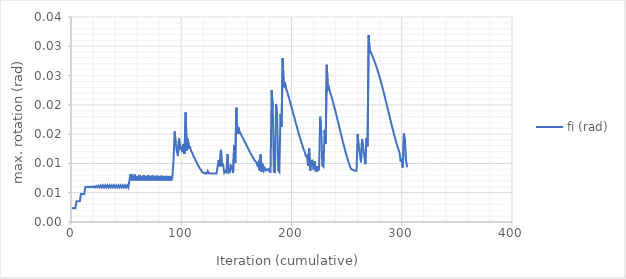
| Category | fi (rad) |
|---|---|
| 1.0 | 0.002 |
| 2.0 | 0.002 |
| 3.0 | 0.002 |
| 4.0 | 0.002 |
| 5.0 | 0.004 |
| 6.0 | 0.004 |
| 7.0 | 0.004 |
| 8.0 | 0.004 |
| 9.0 | 0.005 |
| 10.0 | 0.005 |
| 11.0 | 0.005 |
| 12.0 | 0.005 |
| 13.0 | 0.006 |
| 14.0 | 0.006 |
| 15.0 | 0.006 |
| 16.0 | 0.006 |
| 17.0 | 0.006 |
| 18.0 | 0.006 |
| 19.0 | 0.006 |
| 20.0 | 0.006 |
| 21.0 | 0.006 |
| 22.0 | 0.006 |
| 23.0 | 0.006 |
| 24.0 | 0.006 |
| 25.0 | 0.006 |
| 26.0 | 0.006 |
| 27.0 | 0.006 |
| 28.0 | 0.006 |
| 29.0 | 0.006 |
| 30.0 | 0.006 |
| 31.0 | 0.006 |
| 32.0 | 0.006 |
| 33.0 | 0.006 |
| 34.0 | 0.006 |
| 35.0 | 0.006 |
| 36.0 | 0.006 |
| 37.0 | 0.006 |
| 38.0 | 0.006 |
| 39.0 | 0.006 |
| 40.0 | 0.006 |
| 41.0 | 0.006 |
| 42.0 | 0.006 |
| 43.0 | 0.006 |
| 44.0 | 0.006 |
| 45.0 | 0.006 |
| 46.0 | 0.006 |
| 47.0 | 0.006 |
| 48.0 | 0.006 |
| 49.0 | 0.006 |
| 50.0 | 0.006 |
| 51.0 | 0.006 |
| 52.0 | 0.006 |
| 53.0 | 0.007 |
| 54.0 | 0.008 |
| 55.0 | 0.007 |
| 56.0 | 0.008 |
| 57.0 | 0.007 |
| 58.0 | 0.008 |
| 59.0 | 0.007 |
| 60.0 | 0.008 |
| 61.0 | 0.007 |
| 62.0 | 0.008 |
| 63.0 | 0.007 |
| 64.0 | 0.008 |
| 65.0 | 0.007 |
| 66.0 | 0.008 |
| 67.0 | 0.007 |
| 68.0 | 0.008 |
| 69.0 | 0.007 |
| 70.0 | 0.008 |
| 71.0 | 0.007 |
| 72.0 | 0.008 |
| 73.0 | 0.007 |
| 74.0 | 0.008 |
| 75.0 | 0.007 |
| 76.0 | 0.008 |
| 77.0 | 0.007 |
| 78.0 | 0.008 |
| 79.0 | 0.007 |
| 80.0 | 0.008 |
| 81.0 | 0.007 |
| 82.0 | 0.008 |
| 83.0 | 0.007 |
| 84.0 | 0.008 |
| 85.0 | 0.007 |
| 86.0 | 0.008 |
| 87.0 | 0.007 |
| 88.0 | 0.008 |
| 89.0 | 0.007 |
| 90.0 | 0.008 |
| 91.0 | 0.007 |
| 92.0 | 0.008 |
| 93.0 | 0.011 |
| 94.0 | 0.015 |
| 95.0 | 0.014 |
| 96.0 | 0.012 |
| 97.0 | 0.011 |
| 98.0 | 0.014 |
| 99.0 | 0.012 |
| 100.0 | 0.013 |
| 101.0 | 0.012 |
| 102.0 | 0.013 |
| 103.0 | 0.012 |
| 104.0 | 0.019 |
| 105.0 | 0.012 |
| 106.0 | 0.014 |
| 107.0 | 0.013 |
| 108.0 | 0.013 |
| 109.0 | 0.012 |
| 110.0 | 0.012 |
| 111.0 | 0.011 |
| 112.0 | 0.011 |
| 113.0 | 0.011 |
| 114.0 | 0.01 |
| 115.0 | 0.01 |
| 116.0 | 0.009 |
| 117.0 | 0.009 |
| 118.0 | 0.009 |
| 119.0 | 0.009 |
| 120.0 | 0.008 |
| 121.0 | 0.008 |
| 122.0 | 0.008 |
| 123.0 | 0.008 |
| 124.0 | 0.009 |
| 125.0 | 0.008 |
| 126.0 | 0.008 |
| 127.0 | 0.008 |
| 128.0 | 0.008 |
| 129.0 | 0.008 |
| 130.0 | 0.008 |
| 131.0 | 0.008 |
| 132.0 | 0.008 |
| 133.0 | 0.009 |
| 134.0 | 0.011 |
| 135.0 | 0.009 |
| 136.0 | 0.012 |
| 137.0 | 0.01 |
| 138.0 | 0.01 |
| 139.0 | 0.008 |
| 140.0 | 0.009 |
| 141.0 | 0.009 |
| 142.0 | 0.012 |
| 143.0 | 0.008 |
| 144.0 | 0.008 |
| 145.0 | 0.01 |
| 146.0 | 0.009 |
| 147.0 | 0.008 |
| 148.0 | 0.013 |
| 149.0 | 0.01 |
| 150.0 | 0.02 |
| 151.0 | 0.015 |
| 152.0 | 0.016 |
| 153.0 | 0.015 |
| 154.0 | 0.015 |
| 155.0 | 0.015 |
| 156.0 | 0.014 |
| 157.0 | 0.014 |
| 158.0 | 0.014 |
| 159.0 | 0.013 |
| 160.0 | 0.013 |
| 161.0 | 0.012 |
| 162.0 | 0.012 |
| 163.0 | 0.012 |
| 164.0 | 0.011 |
| 165.0 | 0.011 |
| 166.0 | 0.011 |
| 167.0 | 0.01 |
| 168.0 | 0.01 |
| 169.0 | 0.01 |
| 170.0 | 0.01 |
| 171.0 | 0.009 |
| 172.0 | 0.012 |
| 173.0 | 0.009 |
| 174.0 | 0.01 |
| 175.0 | 0.009 |
| 176.0 | 0.009 |
| 177.0 | 0.009 |
| 178.0 | 0.009 |
| 179.0 | 0.009 |
| 180.0 | 0.009 |
| 181.0 | 0.009 |
| 182.0 | 0.023 |
| 183.0 | 0.02 |
| 184.0 | 0.009 |
| 185.0 | 0.009 |
| 186.0 | 0.02 |
| 187.0 | 0.018 |
| 188.0 | 0.009 |
| 189.0 | 0.009 |
| 190.0 | 0.018 |
| 191.0 | 0.016 |
| 192.0 | 0.028 |
| 193.0 | 0.023 |
| 194.0 | 0.024 |
| 195.0 | 0.023 |
| 196.0 | 0.022 |
| 197.0 | 0.022 |
| 198.0 | 0.021 |
| 199.0 | 0.02 |
| 200.0 | 0.02 |
| 201.0 | 0.019 |
| 202.0 | 0.018 |
| 203.0 | 0.018 |
| 204.0 | 0.017 |
| 205.0 | 0.016 |
| 206.0 | 0.015 |
| 207.0 | 0.015 |
| 208.0 | 0.014 |
| 209.0 | 0.014 |
| 210.0 | 0.013 |
| 211.0 | 0.012 |
| 212.0 | 0.012 |
| 213.0 | 0.011 |
| 214.0 | 0.011 |
| 215.0 | 0.01 |
| 216.0 | 0.013 |
| 217.0 | 0.009 |
| 218.0 | 0.01 |
| 219.0 | 0.01 |
| 220.0 | 0.009 |
| 221.0 | 0.01 |
| 222.0 | 0.009 |
| 223.0 | 0.01 |
| 224.0 | 0.009 |
| 225.0 | 0.009 |
| 226.0 | 0.018 |
| 227.0 | 0.015 |
| 228.0 | 0.01 |
| 229.0 | 0.009 |
| 230.0 | 0.016 |
| 231.0 | 0.013 |
| 232.0 | 0.027 |
| 233.0 | 0.023 |
| 234.0 | 0.023 |
| 235.0 | 0.022 |
| 236.0 | 0.022 |
| 237.0 | 0.021 |
| 238.0 | 0.02 |
| 239.0 | 0.02 |
| 240.0 | 0.019 |
| 241.0 | 0.018 |
| 242.0 | 0.017 |
| 243.0 | 0.016 |
| 244.0 | 0.016 |
| 245.0 | 0.015 |
| 246.0 | 0.014 |
| 247.0 | 0.013 |
| 248.0 | 0.013 |
| 249.0 | 0.012 |
| 250.0 | 0.011 |
| 251.0 | 0.011 |
| 252.0 | 0.01 |
| 253.0 | 0.01 |
| 254.0 | 0.009 |
| 255.0 | 0.009 |
| 256.0 | 0.009 |
| 257.0 | 0.009 |
| 258.0 | 0.009 |
| 259.0 | 0.009 |
| 260.0 | 0.015 |
| 261.0 | 0.013 |
| 262.0 | 0.012 |
| 263.0 | 0.01 |
| 264.0 | 0.014 |
| 265.0 | 0.013 |
| 266.0 | 0.011 |
| 267.0 | 0.01 |
| 268.0 | 0.014 |
| 269.0 | 0.013 |
| 270.0 | 0.032 |
| 271.0 | 0.029 |
| 272.0 | 0.029 |
| 273.0 | 0.028 |
| 274.0 | 0.028 |
| 275.0 | 0.028 |
| 276.0 | 0.027 |
| 277.0 | 0.027 |
| 278.0 | 0.026 |
| 279.0 | 0.025 |
| 280.0 | 0.025 |
| 281.0 | 0.024 |
| 282.0 | 0.023 |
| 283.0 | 0.023 |
| 284.0 | 0.022 |
| 285.0 | 0.021 |
| 286.0 | 0.02 |
| 287.0 | 0.02 |
| 288.0 | 0.019 |
| 289.0 | 0.018 |
| 290.0 | 0.017 |
| 291.0 | 0.016 |
| 292.0 | 0.016 |
| 293.0 | 0.015 |
| 294.0 | 0.014 |
| 295.0 | 0.014 |
| 296.0 | 0.013 |
| 297.0 | 0.012 |
| 298.0 | 0.012 |
| 299.0 | 0.01 |
| 300.0 | 0.011 |
| 301.0 | 0.009 |
| 302.0 | 0.015 |
| 303.0 | 0.014 |
| 304.0 | 0.01 |
| 305.0 | 0.009 |
| 305.0 | 0.009 |
| 305.0 | 0.009 |
| 305.0 | 0.009 |
| 305.0 | 0.009 |
| 305.0 | 0.009 |
| 305.0 | 0.009 |
| 305.0 | 0.009 |
| 305.0 | 0.009 |
| 305.0 | 0.009 |
| 305.0 | 0.009 |
| 305.0 | 0.009 |
| 305.0 | 0.009 |
| 305.0 | 0.009 |
| 305.0 | 0.009 |
| 305.0 | 0.009 |
| 305.0 | 0.009 |
| 305.0 | 0.009 |
| 305.0 | 0.009 |
| 305.0 | 0.009 |
| 305.0 | 0.009 |
| 305.0 | 0.009 |
| 305.0 | 0.009 |
| 305.0 | 0.009 |
| 305.0 | 0.009 |
| 305.0 | 0.009 |
| 305.0 | 0.009 |
| 305.0 | 0.009 |
| 305.0 | 0.009 |
| 305.0 | 0.009 |
| 305.0 | 0.009 |
| 305.0 | 0.009 |
| 305.0 | 0.009 |
| 305.0 | 0.009 |
| 305.0 | 0.009 |
| 305.0 | 0.009 |
| 305.0 | 0.009 |
| 305.0 | 0.009 |
| 305.0 | 0.009 |
| 305.0 | 0.009 |
| 305.0 | 0.009 |
| 305.0 | 0.009 |
| 305.0 | 0.009 |
| 305.0 | 0.009 |
| 305.0 | 0.009 |
| 305.0 | 0.009 |
| 305.0 | 0.009 |
| 305.0 | 0.009 |
| 305.0 | 0.009 |
| 305.0 | 0.009 |
| 305.0 | 0.009 |
| 305.0 | 0.009 |
| 305.0 | 0.009 |
| 305.0 | 0.009 |
| 305.0 | 0.009 |
| 305.0 | 0.009 |
| 305.0 | 0.009 |
| 305.0 | 0.009 |
| 305.0 | 0.009 |
| 305.0 | 0.009 |
| 305.0 | 0.009 |
| 305.0 | 0.009 |
| 305.0 | 0.009 |
| 305.0 | 0.009 |
| 305.0 | 0.009 |
| 305.0 | 0.009 |
| 305.0 | 0.009 |
| 305.0 | 0.009 |
| 305.0 | 0.009 |
| 305.0 | 0.009 |
| 305.0 | 0.009 |
| 305.0 | 0.009 |
| 305.0 | 0.009 |
| 305.0 | 0.009 |
| 305.0 | 0.009 |
| 305.0 | 0.009 |
| 305.0 | 0.009 |
| 305.0 | 0.009 |
| 305.0 | 0.009 |
| 305.0 | 0.009 |
| 305.0 | 0.009 |
| 305.0 | 0.009 |
| 305.0 | 0.009 |
| 305.0 | 0.009 |
| 305.0 | 0.009 |
| 305.0 | 0.009 |
| 305.0 | 0.009 |
| 305.0 | 0.009 |
| 305.0 | 0.009 |
| 305.0 | 0.009 |
| 305.0 | 0.009 |
| 305.0 | 0.009 |
| 305.0 | 0.009 |
| 305.0 | 0.009 |
| 305.0 | 0.009 |
| 305.0 | 0.009 |
| 305.0 | 0.009 |
| 305.0 | 0.009 |
| 305.0 | 0.009 |
| 305.0 | 0.009 |
| 305.0 | 0.009 |
| 305.0 | 0.009 |
| 305.0 | 0.009 |
| 305.0 | 0.009 |
| 305.0 | 0.009 |
| 305.0 | 0.009 |
| 305.0 | 0.009 |
| 305.0 | 0.009 |
| 305.0 | 0.009 |
| 305.0 | 0.009 |
| 305.0 | 0.009 |
| 305.0 | 0.009 |
| 305.0 | 0.009 |
| 305.0 | 0.009 |
| 305.0 | 0.009 |
| 305.0 | 0.009 |
| 305.0 | 0.009 |
| 305.0 | 0.009 |
| 305.0 | 0.009 |
| 305.0 | 0.009 |
| 305.0 | 0.009 |
| 305.0 | 0.009 |
| 305.0 | 0.009 |
| 305.0 | 0.009 |
| 305.0 | 0.009 |
| 305.0 | 0.009 |
| 305.0 | 0.009 |
| 305.0 | 0.009 |
| 305.0 | 0.009 |
| 305.0 | 0.009 |
| 305.0 | 0.009 |
| 305.0 | 0.009 |
| 305.0 | 0.009 |
| 305.0 | 0.009 |
| 305.0 | 0.009 |
| 305.0 | 0.009 |
| 305.0 | 0.009 |
| 305.0 | 0.009 |
| 305.0 | 0.009 |
| 305.0 | 0.009 |
| 305.0 | 0.009 |
| 305.0 | 0.009 |
| 305.0 | 0.009 |
| 305.0 | 0.009 |
| 305.0 | 0.009 |
| 305.0 | 0.009 |
| 305.0 | 0.009 |
| 305.0 | 0.009 |
| 305.0 | 0.009 |
| 305.0 | 0.009 |
| 305.0 | 0.009 |
| 305.0 | 0.009 |
| 305.0 | 0.009 |
| 305.0 | 0.009 |
| 305.0 | 0.009 |
| 305.0 | 0.009 |
| 305.0 | 0.009 |
| 305.0 | 0.009 |
| 305.0 | 0.009 |
| 305.0 | 0.009 |
| 305.0 | 0.009 |
| 305.0 | 0.009 |
| 305.0 | 0.009 |
| 305.0 | 0.009 |
| 305.0 | 0.009 |
| 305.0 | 0.009 |
| 305.0 | 0.009 |
| 305.0 | 0.009 |
| 305.0 | 0.009 |
| 305.0 | 0.009 |
| 305.0 | 0.009 |
| 305.0 | 0.009 |
| 305.0 | 0.009 |
| 305.0 | 0.009 |
| 305.0 | 0.009 |
| 305.0 | 0.009 |
| 305.0 | 0.009 |
| 305.0 | 0.009 |
| 305.0 | 0.009 |
| 305.0 | 0.009 |
| 305.0 | 0.009 |
| 305.0 | 0.009 |
| 305.0 | 0.009 |
| 305.0 | 0.009 |
| 305.0 | 0.009 |
| 305.0 | 0.009 |
| 305.0 | 0.009 |
| 305.0 | 0.009 |
| 305.0 | 0.009 |
| 305.0 | 0.009 |
| 305.0 | 0.009 |
| 305.0 | 0.009 |
| 305.0 | 0.009 |
| 305.0 | 0.009 |
| 305.0 | 0.009 |
| 305.0 | 0.009 |
| 305.0 | 0.009 |
| 305.0 | 0.009 |
| 305.0 | 0.009 |
| 305.0 | 0.009 |
| 305.0 | 0.009 |
| 305.0 | 0.009 |
| 305.0 | 0.009 |
| 305.0 | 0.009 |
| 305.0 | 0.009 |
| 305.0 | 0.009 |
| 305.0 | 0.009 |
| 305.0 | 0.009 |
| 305.0 | 0.009 |
| 305.0 | 0.009 |
| 305.0 | 0.009 |
| 305.0 | 0.009 |
| 305.0 | 0.009 |
| 305.0 | 0.009 |
| 305.0 | 0.009 |
| 305.0 | 0.009 |
| 305.0 | 0.009 |
| 305.0 | 0.009 |
| 305.0 | 0.009 |
| 305.0 | 0.009 |
| 305.0 | 0.009 |
| 305.0 | 0.009 |
| 305.0 | 0.009 |
| 305.0 | 0.009 |
| 305.0 | 0.009 |
| 305.0 | 0.009 |
| 305.0 | 0.009 |
| 305.0 | 0.009 |
| 305.0 | 0.009 |
| 305.0 | 0.009 |
| 305.0 | 0.009 |
| 305.0 | 0.009 |
| 305.0 | 0.009 |
| 305.0 | 0.009 |
| 305.0 | 0.009 |
| 305.0 | 0.009 |
| 305.0 | 0.009 |
| 305.0 | 0.009 |
| 305.0 | 0.009 |
| 305.0 | 0.009 |
| 305.0 | 0.009 |
| 305.0 | 0.009 |
| 305.0 | 0.009 |
| 305.0 | 0.009 |
| 305.0 | 0.009 |
| 305.0 | 0.009 |
| 305.0 | 0.009 |
| 305.0 | 0.009 |
| 305.0 | 0.009 |
| 305.0 | 0.009 |
| 305.0 | 0.009 |
| 305.0 | 0.009 |
| 305.0 | 0.009 |
| 305.0 | 0.009 |
| 305.0 | 0.009 |
| 305.0 | 0.009 |
| 305.0 | 0.009 |
| 305.0 | 0.009 |
| 305.0 | 0.009 |
| 305.0 | 0.009 |
| 305.0 | 0.009 |
| 305.0 | 0.009 |
| 305.0 | 0.009 |
| 305.0 | 0.009 |
| 305.0 | 0.009 |
| 305.0 | 0.009 |
| 305.0 | 0.009 |
| 305.0 | 0.009 |
| 305.0 | 0.009 |
| 305.0 | 0.009 |
| 305.0 | 0.009 |
| 305.0 | 0.009 |
| 305.0 | 0.009 |
| 305.0 | 0.009 |
| 305.0 | 0.009 |
| 305.0 | 0.009 |
| 305.0 | 0.009 |
| 305.0 | 0.009 |
| 305.0 | 0.009 |
| 305.0 | 0.009 |
| 305.0 | 0.009 |
| 305.0 | 0.009 |
| 305.0 | 0.009 |
| 305.0 | 0.009 |
| 305.0 | 0.009 |
| 305.0 | 0.009 |
| 305.0 | 0.009 |
| 305.0 | 0.009 |
| 305.0 | 0.009 |
| 305.0 | 0.009 |
| 305.0 | 0.009 |
| 305.0 | 0.009 |
| 305.0 | 0.009 |
| 305.0 | 0.009 |
| 305.0 | 0.009 |
| 305.0 | 0.009 |
| 305.0 | 0.009 |
| 305.0 | 0.009 |
| 305.0 | 0.009 |
| 305.0 | 0.009 |
| 305.0 | 0.009 |
| 305.0 | 0.009 |
| 305.0 | 0.009 |
| 305.0 | 0.009 |
| 305.0 | 0.009 |
| 305.0 | 0.009 |